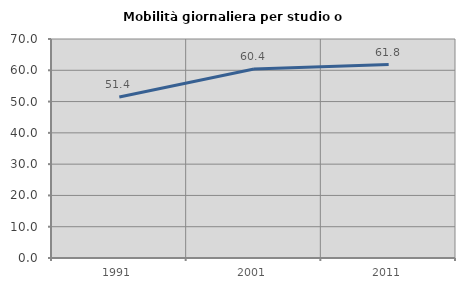
| Category | Mobilità giornaliera per studio o lavoro |
|---|---|
| 1991.0 | 51.445 |
| 2001.0 | 60.436 |
| 2011.0 | 61.825 |